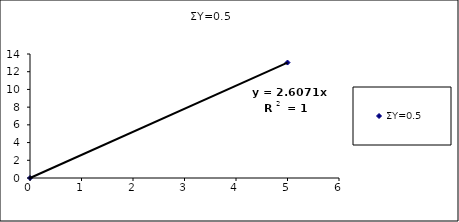
| Category | ΣΥ=0.5 |
|---|---|
| 0.0 | 0 |
| 5.0 | 13.036 |